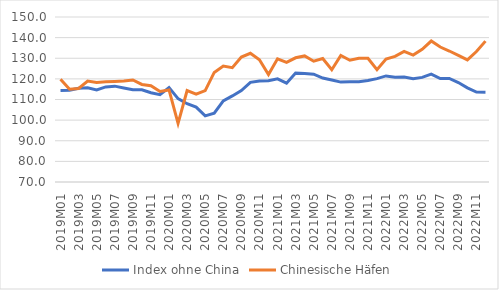
| Category | Index ohne China | Chinesische Häfen |
|---|---|---|
| 2019M01 | 114.385 | 119.842 |
| 2019M02 | 114.464 | 114.987 |
| 2019M03 | 115.418 | 115.366 |
| 2019M04 | 115.661 | 118.946 |
| 2019M05 | 114.668 | 118.28 |
| 2019M06 | 116.116 | 118.583 |
| 2019M07 | 116.476 | 118.757 |
| 2019M08 | 115.598 | 118.972 |
| 2019M09 | 114.689 | 119.445 |
| 2019M10 | 114.675 | 117.304 |
| 2019M11 | 113.308 | 116.671 |
| 2019M12 | 112.367 | 113.858 |
| 2020M01 | 115.775 | 114.636 |
| 2020M02 | 110.445 | 98.424 |
| 2020M03 | 107.962 | 114.307 |
| 2020M04 | 106.297 | 112.586 |
| 2020M05 | 102.036 | 114.341 |
| 2020M06 | 103.404 | 123.134 |
| 2020M07 | 109.324 | 126.221 |
| 2020M08 | 111.733 | 125.437 |
| 2020M09 | 114.364 | 130.609 |
| 2020M10 | 118.3 | 132.417 |
| 2020M11 | 119.001 | 129.29 |
| 2020M12 | 119.078 | 122.076 |
| 2021M01 | 120.048 | 129.739 |
| 2021M02 | 117.934 | 128.004 |
| 2021M03 | 122.837 | 130.222 |
| 2021M04 | 122.65 | 131.131 |
| 2021M05 | 122.295 | 128.569 |
| 2021M06 | 120.405 | 129.836 |
| 2021M07 | 119.42 | 124.408 |
| 2021M08 | 118.429 | 131.35 |
| 2021M09 | 118.661 | 129.045 |
| 2021M10 | 118.66 | 129.963 |
| 2021M11 | 119.191 | 129.943 |
| 2021M12 | 120.108 | 124.429 |
| 2022M01 | 121.428 | 129.571 |
| 2022M02 | 120.838 | 130.909 |
| 2022M03 | 120.915 | 133.341 |
| 2022M04 | 120.09 | 131.536 |
| 2022M05 | 120.714 | 134.364 |
| 2022M06 | 122.313 | 138.355 |
| 2022M07 | 120.133 | 135.437 |
| 2022M08 | 120.185 | 133.508 |
| 2022M09 | 118.24 | 131.398 |
| 2022M10 | 115.625 | 129.214 |
| 2022M11 | 113.617 | 133.28 |
| 2022M12 | 113.549 | 138.306 |